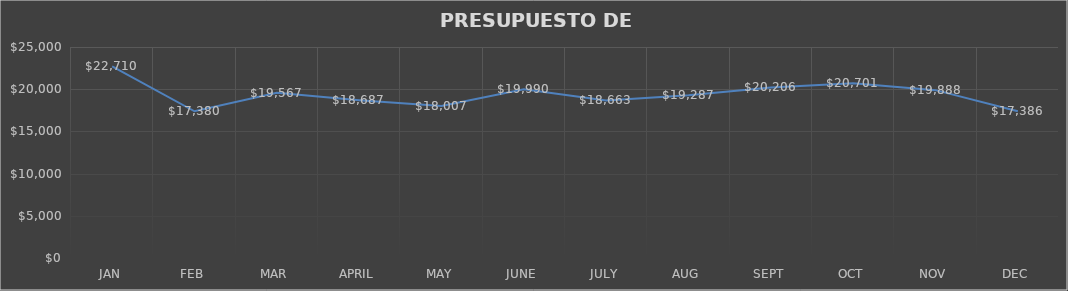
| Category | Series 0 |
|---|---|
| JAN | 22710 |
| FEB | 17380 |
| MAR | 19567 |
| APRIL | 18687 |
| MAY | 18007 |
| JUNE | 19990 |
| JULY | 18663 |
| AUG | 19287 |
| SEPT | 20206 |
| OCT | 20701 |
| NOV | 19888 |
| DEC | 17386 |